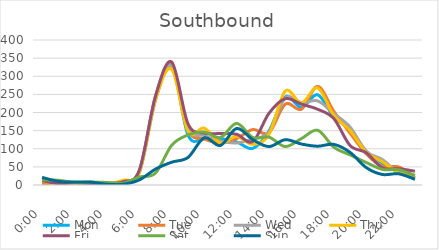
| Category | Mon | Tue | Wed | Thu | Fri | Sat | Sun |
|---|---|---|---|---|---|---|---|
| 0.0 | 7 | 4 | 10 | 11 | 12 | 14 | 21 |
| 0.041667 | 2 | 5 | 5 | 2 | 4 | 13 | 10 |
| 0.083333 | 3 | 4 | 3 | 5 | 6 | 7 | 8 |
| 0.125 | 0 | 0 | 2 | 5 | 4 | 8 | 8 |
| 0.166667 | 2 | 6 | 3 | 3 | 4 | 7 | 2 |
| 0.208333 | 5 | 8 | 10 | 13 | 9 | 5 | 2 |
| 0.25 | 37 | 39 | 34 | 35 | 41 | 22 | 14 |
| 0.291667 | 238 | 245 | 235 | 236 | 246 | 33 | 44 |
| 0.333333 | 330 | 335 | 327 | 319 | 339 | 110 | 63 |
| 0.375 | 138 | 153 | 156 | 148 | 169 | 138 | 76 |
| 0.416667 | 127 | 127 | 136 | 157 | 143 | 146 | 130 |
| 0.458333 | 128 | 116 | 121 | 116 | 142 | 131 | 109 |
| 0.5 | 119 | 128 | 116 | 134 | 140 | 170 | 156 |
| 0.541667 | 101 | 153 | 127 | 112 | 120 | 131 | 125 |
| 0.5833333333333334 | 149 | 144 | 146 | 140 | 198 | 132 | 106 |
| 0.625 | 243 | 223 | 240 | 259 | 238 | 106 | 125 |
| 0.666667 | 214 | 209 | 227 | 226 | 223 | 128 | 113 |
| 0.708333 | 249 | 272 | 232 | 268 | 209 | 151 | 107 |
| 0.75 | 188 | 203 | 197 | 192 | 183 | 104 | 112 |
| 0.791667 | 153 | 143 | 160 | 150 | 109 | 83 | 90 |
| 0.833333 | 93 | 86 | 93 | 90 | 89 | 62 | 48 |
| 0.875 | 60 | 51 | 70 | 64 | 47 | 43 | 29 |
| 0.916667 | 35 | 50 | 33 | 34 | 45 | 42 | 31 |
| 0.958333 | 16 | 21 | 20 | 27 | 38 | 26 | 16 |